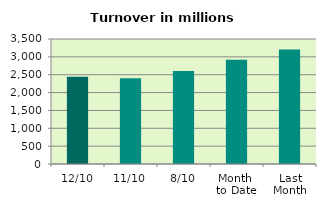
| Category | Series 0 |
|---|---|
| 12/10 | 2443.637 |
| 11/10 | 2402.593 |
| 8/10 | 2600.893 |
| Month 
to Date | 2918.594 |
| Last
Month | 3204.516 |